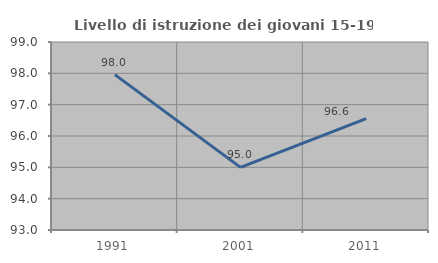
| Category | Livello di istruzione dei giovani 15-19 anni |
|---|---|
| 1991.0 | 97.959 |
| 2001.0 | 95 |
| 2011.0 | 96.552 |